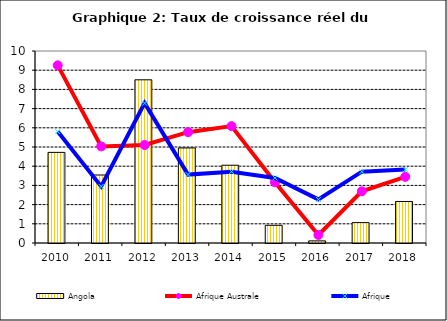
| Category | Angola |
|---|---|
| 2010.0 | 4.72 |
| 2011.0 | 3.542 |
| 2012.0 | 8.5 |
| 2013.0 | 4.951 |
| 2014.0 | 4.051 |
| 2015.0 | 0.922 |
| 2016.0 | 0.11 |
| 2017.0 | 1.062 |
| 2018.0 | 2.163 |